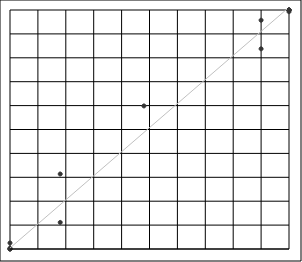
| Category | Series 0 |
|---|---|
| 0.0 | 0 |
| 0.0 | 0.002 |
| 0.0 | 0.031 |
| 0.0 | 0.357 |
| 0.0 | 2.53 |
| 18.0 | 11.124 |
| 18.0 | 31.382 |
| 48.0 | 59.866 |
| 90.0 | 83.764 |
| 90.0 | 95.726 |
| 100.0 | 99.295 |
| 100.0 | 99.929 |
| 100.0 | 99.996 |
| 100.0 | 100 |
| 100.0 | 100 |
| 100.0 | 100 |